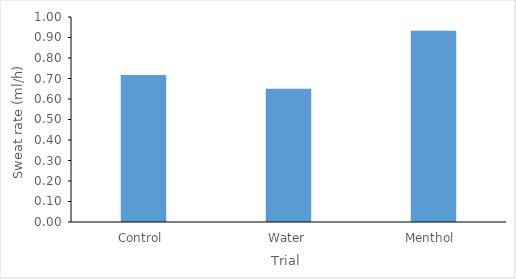
| Category | Series 0 |
|---|---|
| Control  | 0.717 |
| Water | 0.65 |
| Menthol  | 0.933 |